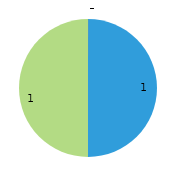
| Category | Tuesday | Department |
|---|---|---|
| 0 | 1 | 0 |
| 1 | 1 | 0 |
| 2 | 0 | 0 |
| 3 | 0 | 0 |
| 4 | 0 | 0 |
| 5 | 0 | 0 |
| 6 | 0 | 0 |
| 7 | 0 | 0 |
| 8 | 0 | 0 |
| 9 | 0 | 0 |
| 10 | 0 | 0 |
| 11 | 0 | 0 |
| 12 | 0 | 0 |
| 13 | 0 | 0 |
| 14 | 0 | 0 |
| 15 | 0 | 0 |
| 16 | 0 | 0 |
| 17 | 0 | 0 |
| 18 | 0 | 0 |
| 19 | 0 | 0 |